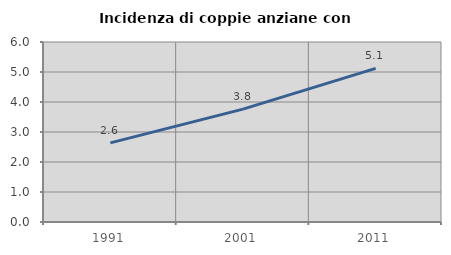
| Category | Incidenza di coppie anziane con figli |
|---|---|
| 1991.0 | 2.637 |
| 2001.0 | 3.764 |
| 2011.0 | 5.12 |